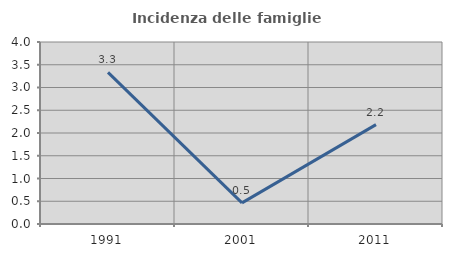
| Category | Incidenza delle famiglie numerose |
|---|---|
| 1991.0 | 3.333 |
| 2001.0 | 0.465 |
| 2011.0 | 2.183 |